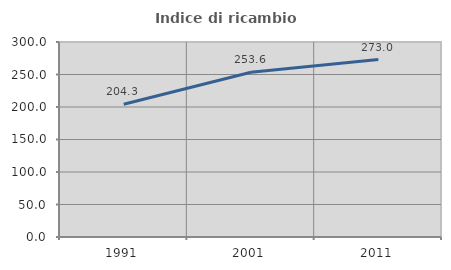
| Category | Indice di ricambio occupazionale  |
|---|---|
| 1991.0 | 204.286 |
| 2001.0 | 253.571 |
| 2011.0 | 273.016 |